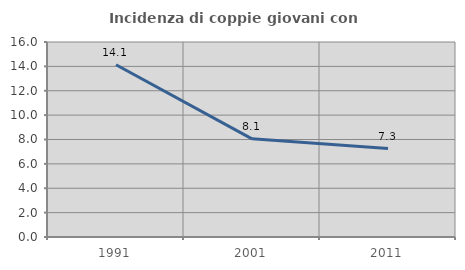
| Category | Incidenza di coppie giovani con figli |
|---|---|
| 1991.0 | 14.134 |
| 2001.0 | 8.055 |
| 2011.0 | 7.252 |